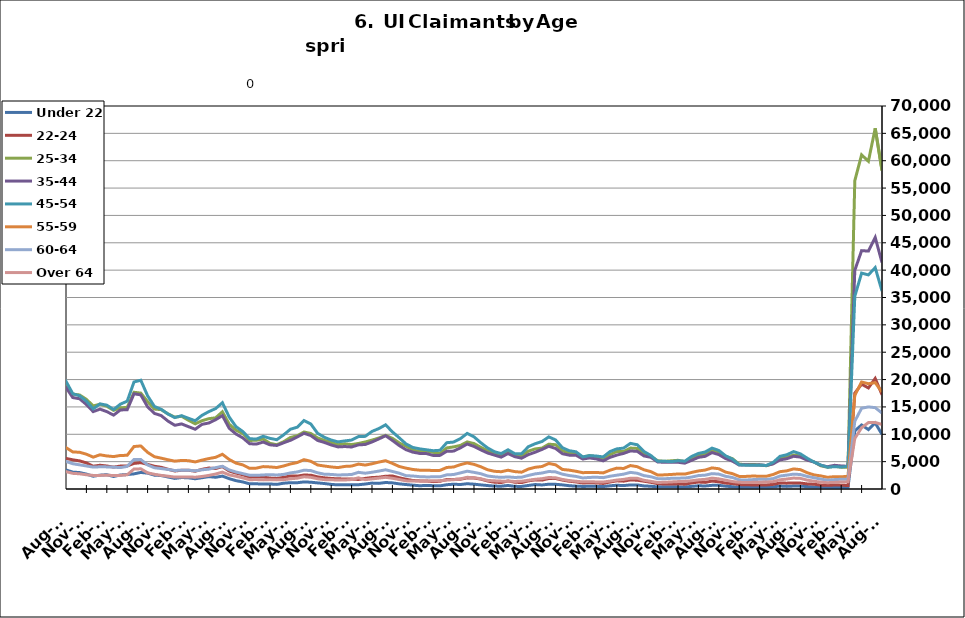
| Category | Under 22 | 22-24 | 25-34 | 35-44 | 45-54 | 55-59 | 60-64 | Over 64 |
|---|---|---|---|---|---|---|---|---|
| 1995-02-28 | 535 | 933 | 5740 | 6206 | 4029 | 1255 | 625 | 276 |
| 1995-03-31 | 534 | 992 | 5856 | 6433 | 4297 | 1294 | 686 | 323 |
| 1995-04-30 | 603 | 1125 | 6814 | 6965 | 4447 | 1392 | 730 | 338 |
| 1995-05-31 | 626 | 1171 | 7442 | 7404 | 4702 | 1383 | 751 | 333 |
| 1995-06-30 | 625 | 1218 | 7514 | 7778 | 4867 | 1435 | 813 | 366 |
| 1995-07-31 | 710 | 1296 | 8612 | 8864 | 5537 | 1595 | 891 | 407 |
| 1995-08-31 | 729 | 1248 | 8185 | 8719 | 5400 | 1604 | 982 | 406 |
| 1995-09-30 | 578 | 1028 | 6615 | 7150 | 4534 | 1351 | 862 | 338 |
| 1995-10-31 | 554 | 957 | 5805 | 6461 | 4159 | 1205 | 741 | 287 |
| 1995-11-30 | 468 | 845 | 5201 | 5826 | 3927 | 1155 | 702 | 254 |
| 1995-12-31 | 517 | 858 | 5350 | 5974 | 4010 | 1153 | 672 | 263 |
| 1996-01-31 | 543 | 927 | 5431 | 6086 | 4208 | 1221 | 685 | 301 |
| 1996-02-29 | 617 | 999 | 5667 | 6535 | 4480 | 1312 | 747 | 305 |
| 1996-03-31 | 622 | 981 | 5896 | 6557 | 4514 | 1362 | 763 | 306 |
| 1996-04-30 | 680 | 1140 | 7032 | 7649 | 5088 | 1527 | 856 | 345 |
| 1996-05-31 | 689 | 1163 | 7220 | 7819 | 5070 | 1521 | 832 | 366 |
| 1996-06-30 | 661 | 1145 | 7344 | 8173 | 5391 | 1568 | 844 | 388 |
| 1996-07-31 | 762 | 1250 | 8375 | 9181 | 6036 | 1755 | 973 | 432 |
| 1996-08-31 | 746 | 1145 | 7829 | 8585 | 5586 | 1651 | 950 | 435 |
| 1996-09-30 | 635 | 992 | 6399 | 7097 | 4790 | 1462 | 804 | 425 |
| 1996-10-31 | 572 | 851 | 5448 | 6291 | 4192 | 1259 | 693 | 340 |
| 1996-11-30 | 531 | 827 | 5003 | 5921 | 3908 | 1153 | 602 | 315 |
| 1996-12-31 | 521 | 789 | 4710 | 5510 | 3673 | 1110 | 610 | 284 |
| 1997-01-31 | 559 | 841 | 5203 | 6172 | 4321 | 1255 | 731 | 328 |
| 1997-02-28 | 556 | 841 | 5187 | 6162 | 4311 | 1250 | 727 | 326 |
| 1997-03-31 | 499 | 806 | 5125 | 6037 | 4176 | 1294 | 702 | 363 |
| 1997-04-30 | 545 | 885 | 5753 | 6709 | 4248 | 1339 | 734 | 339 |
| 1997-05-31 | 612 | 941 | 6146 | 7153 | 4458 | 1348 | 801 | 336 |
| 1997-06-30 | 623 | 995 | 6240 | 7298 | 4662 | 1302 | 776 | 348 |
| 1997-07-31 | 716 | 1154 | 7168 | 8554 | 5489 | 1509 | 903 | 415 |
| 1997-08-31 | 684 | 1072 | 6853 | 8093 | 5222 | 1487 | 837 | 416 |
| 1997-09-30 | 579 | 912 | 5522 | 6592 | 4348 | 1285 | 705 | 380 |
| 1997-10-31 | 516 | 817 | 4894.5 | 5892.5 | 3945 | 1159 | 625 | 344.5 |
| 1997-11-30 | 453 | 722 | 4267 | 5193 | 3542 | 1033 | 545 | 309 |
| 1997-12-31 | 413 | 682 | 3792 | 4755 | 3300 | 1023 | 490 | 266 |
| 1998-01-31 | 489 | 741 | 4044 | 5115 | 3513 | 1099 | 525 | 267 |
| 1998-02-28 | 435 | 684 | 3864 | 4903 | 3549 | 1043 | 571 | 285 |
| 1998-03-31 | 416 | 680 | 3855 | 5086 | 3703 | 1176 | 604 | 297 |
| 1998-04-30 | 592 | 813 | 5092 | 6219 | 4262 | 1336 | 688 | 332 |
| 1998-05-31 | 579 | 849 | 5319 | 6766 | 4554 | 1382 | 729 | 360 |
| 1998-06-30 | 568 | 899 | 5557 | 7101 | 4897 | 1405 | 783 | 367 |
| 1998-07-31 | 691 | 1031 | 6472 | 8095 | 5562 | 1589 | 880 | 392 |
| 1998-08-31 | 673 | 1007 | 6326 | 7950 | 5369 | 1574 | 935 | 393 |
| 1998-09-30 | 548 | 838 | 5206 | 6768 | 4703 | 1432 | 849 | 373 |
| 1998-10-31 | 496 | 776 | 4437 | 5582 | 3875 | 1250 | 711 | 302 |
| 1998-11-30 | 456 | 761 | 4182 | 5332 | 4015 | 1296 | 694 | 308 |
| 1998-12-31 | 442 | 722 | 4010 | 5198 | 4062 | 1331 | 656 | 290 |
| 1999-01-31 | 503 | 830 | 4502 | 5761 | 4521 | 1490 | 751 | 297 |
| 1999-02-28 | 463 | 756 | 4267 | 5576 | 4431 | 1470 | 767 | 301 |
| 1999-03-31 | 435 | 688 | 4119 | 5519 | 4403 | 1516 | 765 | 331 |
| 1999-04-30 | 591 | 949 | 5292 | 7089 | 5468 | 1724 | 914 | 489 |
| 1999-05-31 | 674 | 911 | 5611 | 7459 | 5457 | 1710 | 934 | 500 |
| 1999-06-30 | 640 | 906 | 5660 | 7503 | 5333 | 1695 | 920 | 495 |
| 1999-07-31 | 766 | 1132 | 6820 | 9256 | 6620 | 1981 | 1001 | 549 |
| 1999-08-31 | 738 | 1117 | 6737 | 9030 | 6670 | 2019 | 1075 | 582 |
| 1999-09-30 | 600 | 968 | 5167 | 7169 | 5458 | 1712 | 892 | 465 |
| 1999-10-31 | 494 | 813 | 4501 | 6048 | 4682 | 1443 | 743 | 363 |
| 1999-11-30 | 464 | 768 | 4228 | 5593 | 4564 | 1392 | 702 | 313 |
| 1999-12-31 | 468.5 | 754.5 | 4149 | 5486.5 | 4505 | 1429 | 673 | 304 |
| 2000-01-31 | 473 | 741 | 4070 | 5380 | 4446 | 1466 | 644 | 295 |
| 2000-02-29 | 460 | 691 | 3807 | 5357 | 4470 | 1469 | 707 | 310 |
| 2000-03-31 | 412 | 652 | 3864 | 5499 | 4568 | 1508 | 816 | 389 |
| 2000-04-30 | 585 | 829 | 4741 | 6891 | 5127 | 1631 | 906 | 451 |
| 2000-05-31 | 627 | 875 | 5086 | 7211 | 5238 | 1598 | 956 | 489 |
| 2000-06-30 | 675 | 983 | 5624 | 7826 | 5562 | 1669 | 941 | 524 |
| 2000-07-31 | 802 | 1109 | 6475 | 9102 | 6450 | 1927 | 1097 | 594 |
| 2000-08-31 | 787 | 1058 | 6045 | 8732 | 6157 | 1894 | 1085 | 616 |
| 2000-09-30 | 607 | 897 | 4766 | 6864 | 5037 | 1486 | 902 | 479 |
| 2000-10-31 | 544 | 760 | 4267 | 5897 | 4465 | 1323 | 762 | 394 |
| 2000-11-30 | 535 | 797 | 3982 | 5439 | 4318 | 1256 | 702 | 396 |
| 2000-12-31 | 508 | 832 | 3891 | 5255 | 4218 | 1246 | 694 | 361 |
| 2001-01-31 | 627 | 892 | 4229 | 5724 | 4777 | 1300 | 721 | 393 |
| 2001-02-28 | 643 | 934 | 4553 | 6302 | 5224 | 1529 | 849 | 472 |
| 2001-03-31 | 412 | 648 | 3625 | 5081 | 4551 | 1413 | 778 | 440 |
| 2001-04-30 | 875 | 1276 | 6577 | 8914 | 7196 | 2144 | 1185 | 639 |
| 2001-05-31 | 944 | 1399 | 7133 | 9570 | 7651 | 2265 | 1231 | 679 |
| 2001-06-30 | 1041 | 1584 | 8072 | 11034 | 8621 | 2613 | 1398 | 756 |
| 2001-07-31 | 1135 | 1806 | 9038 | 12514 | 9691 | 2970 | 1611 | 848 |
| 2001-08-31 | 1116 | 1776 | 8753 | 12045 | 9560 | 2963 | 1691 | 898 |
| 2001-09-30 | 1046 | 1705 | 8118 | 11025 | 8788 | 2784 | 1608 | 833 |
| 2001-10-31 | 1094 | 1785 | 8459 | 11114 | 8850 | 2772 | 1610 | 777 |
| 2001-11-30 | 1154 | 1931 | 9131 | 11576 | 9447 | 2973 | 1661 | 778 |
| 2001-12-31 | 1280 | 2191 | 9917 | 11961 | 9905 | 3152 | 1740 | 780 |
| 2002-01-31 | 1330 | 2255 | 10364 | 12730 | 10592 | 3378 | 1843 | 821 |
| 2002-02-28 | 1347 | 2339 | 10349 | 12730 | 10784 | 3499 | 1861 | 867 |
| 2002-03-31 | 1266 | 2231 | 9963 | 12747 | 10614 | 3499 | 1867 | 979 |
| 2002-04-30 | 1412 | 2488 | 11603 | 15825 | 13571 | 4631 | 2389 | 1146 |
| 2002-05-31 | 1455 | 2421 | 11243 | 15509 | 13148 | 4374 | 2359 | 1195 |
| 2002-06-30 | 1534 | 2479 | 11416 | 15594 | 13261 | 4343 | 2365 | 1180 |
| 2002-07-31 | 1513 | 2614 | 11895 | 16242 | 13727 | 4439 | 2428 | 1255 |
| 2002-08-31 | 1022 | 1977 | 8719 | 12054 | 10588 | 3454 | 1990 | 1047 |
| 2002-09-30 | 1391 | 2528 | 10478 | 14010 | 12008 | 3847 | 2161 | 1166 |
| 2002-10-31 | 1401 | 2385 | 9826 | 12727 | 10778 | 3498 | 1886 | 973 |
| 2002-11-30 | 1344 | 2390 | 9846 | 12059 | 10297 | 3367 | 1833 | 958 |
| 2002-12-31 | 1311 | 2403 | 9841 | 11670 | 10177 | 3369 | 1871 | 894 |
| 2003-01-31 | 1311 | 2403 | 9841 | 11670 | 10177 | 3369 | 1871 | 894 |
| 2003-02-28 | 1367 | 2275 | 9730 | 12433 | 10806 | 3687 | 2016 | 974 |
| 2003-03-31 | 1367 | 2357 | 9844 | 12620 | 11167 | 3825 | 2151 | 1094 |
| 2003-04-30 | 1549 | 2525 | 10619 | 14142 | 12182 | 4004 | 2304 | 1190 |
| 2003-05-31 | 1663 | 2698 | 10843 | 14795 | 12539 | 4102 | 2395 | 1256 |
| 2003-06-30 | 1755 | 2770 | 11350 | 15575 | 13251 | 4301 | 2493 | 1325 |
| 2003-07-31 | 1748 | 2791 | 11577 | 15863 | 13772 | 4465 | 2593 | 1371 |
| 2003-08-31 | 1718 | 2653 | 10998 | 15261 | 13219 | 4325 | 2522 | 1359 |
| 2003-09-30 | 1494 | 2521 | 10071 | 13565 | 11659 | 3828 | 2278 | 1286 |
| 2003-10-31 | 1329 | 2432 | 9388 | 12107 | 10693 | 3567 | 2036 | 1129 |
| 2003-11-30 | 1191 | 2226 | 8954 | 11297 | 10037 | 3414 | 2004 | 1068 |
| 2003-12-31 | 1206 | 2184 | 8530 | 10413 | 9335 | 3215 | 1854 | 994 |
| 2004-01-31 | 1216 | 2171 | 8382 | 9858 | 8955 | 2992 | 1736 | 963 |
| 2004-02-29 | 1118 | 1879 | 7614 | 8935 | 8176 | 2761 | 1617 | 943 |
| 2004-03-31 | 1099 | 1749 | 7152 | 8565 | 7769 | 2686 | 1608 | 981 |
| 2004-04-30 | 1241 | 1951 | 7653 | 9981 | 8741 | 2872 | 1685 | 1056 |
| 2004-05-31 | 1245 | 1934 | 7651 | 10203 | 8820 | 2928 | 1703 | 1079 |
| 2004-06-30 | 1316 | 2086 | 8172 | 10636 | 9362 | 3146 | 1843 | 1081 |
| 2004-07-31 | 1476 | 2265 | 8795 | 11511 | 10439 | 3497 | 2008 | 1171 |
| 2004-08-31 | 1390 | 2055 | 8008 | 10418 | 9514 | 3304 | 1909 | 1105 |
| 2004-09-30 | 1129 | 1820 | 6987 | 8661 | 7694 | 2755 | 1623 | 1046 |
| 2004-10-31 | 1037 | 1675 | 6590 | 7964 | 7029 | 2459 | 1461 | 882 |
| 2004-11-30 | 954 | 1638 | 6342 | 7570 | 6733 | 2294 | 1383 | 841 |
| 2004-12-31 | 857 | 1533 | 5921 | 6991 | 6333 | 2225 | 1287 | 764 |
| 2005-01-31 | 893 | 1539 | 6047 | 7410 | 6682 | 2253 | 1274 | 788 |
| 2005-02-28 | 846 | 1361 | 5650 | 6952 | 6404 | 2198 | 1326 | 786 |
| 2005-03-31 | 747 | 1258 | 5313 | 6595 | 6251 | 2151 | 1327 | 742 |
| 2005-04-30 | 877 | 1375 | 5696 | 7717 | 7230 | 2440 | 1401 | 844 |
| 2005-05-31 | 854 | 1408 | 5674 | 7905 | 7454 | 2482 | 1453 | 858 |
| 2005-06-30 | 819 | 1444 | 6028 | 8565 | 7899 | 2613 | 1547 | 890 |
| 2005-07-31 | 900 | 1461 | 6395 | 9124 | 8614 | 2864 | 1640 | 1004 |
| 2005-08-31 | 805 | 1439 | 5917 | 8271 | 8076 | 2692 | 1587 | 945 |
| 2005-09-30 | 631 | 1209 | 4978 | 6413 | 6203 | 2116 | 1312 | 724 |
| 2005-10-31 | 638 | 1134 | 4602 | 6028 | 5688 | 1997 | 1171 | 656 |
| 2005-11-30 | 564 | 1071 | 4409 | 5563 | 5105 | 1791 | 1035 | 580 |
| 2005-12-31 | 523 | 987 | 4014 | 4983 | 4531 | 1673 | 968 | 546 |
| 2006-01-31 | 531 | 925 | 3900 | 5012 | 4793 | 1691 | 1008 | 539 |
| 2006-02-28 | 447 | 804 | 3534 | 4388 | 4403 | 1586 | 980 | 549 |
| 2006-03-31 | 399 | 785 | 3455 | 4472 | 4584 | 1680 | 1069 | 618 |
| 2006-04-30 | 527 | 945 | 4004 | 5859 | 5921 | 1965 | 1251 | 744 |
| 2006-05-31 | 594 | 964 | 4205 | 6365 | 6369 | 2156 | 1327 | 792 |
| 2006-06-30 | 660 | 1113 | 4742 | 7052 | 7094 | 2386 | 1474 | 933 |
| 2006-07-31 | 771 | 1183 | 5214 | 7974 | 8007 | 2685 | 1635 | 1072 |
| 2006-08-31 | 737 | 1202 | 5116 | 7524 | 7553 | 2671 | 1590 | 1019 |
| 2006-09-30 | 596 | 1086 | 4608 | 6175 | 6389 | 2256 | 1287 | 812 |
| 2006-10-31 | 596 | 1056 | 4585 | 5758 | 5788 | 2026 | 1164 | 696 |
| 2006-11-30 | 542 | 1003 | 4370 | 5304 | 5388 | 1812 | 1082 | 604 |
| 2006-12-31 | 553 | 1102 | 4425 | 5291 | 5310 | 1801 | 1099 | 603 |
| 2007-01-31 | 587 | 1147 | 4542 | 5619 | 5506 | 1920 | 1174 | 663 |
| 2007-02-28 | 544 | 1090 | 4490 | 5562 | 5616 | 1982 | 1260 | 705 |
| 2007-03-31 | 558 | 1089 | 4498 | 5595 | 5708 | 2016 | 1378 | 717 |
| 2007-04-30 | 760 | 1203 | 5015 | 6827 | 6871 | 2316 | 1536 | 856 |
| 2007-05-31 | 806 | 1285 | 5542 | 7679 | 7763 | 2571 | 1719 | 1021 |
| 2007-06-30 | 862 | 1340 | 6100 | 8324 | 8341 | 2812 | 1896 | 1060 |
| 2007-07-31 | 980 | 1524 | 6616 | 9184 | 9522 | 3226 | 2038 | 1250 |
| 2007-08-31 | 950 | 1510 | 6266 | 8359 | 8842 | 3033 | 1949 | 1157 |
| 2007-09-30 | 865 | 1595 | 6213 | 7798 | 7957 | 2790 | 1816 | 1090 |
| 2007-10-31 | 883 | 1517 | 6214 | 7229 | 7503 | 2574 | 1630 | 978 |
| 2007-11-15 | 816 | 1424 | 5981 | 6740 | 6999 | 2468 | 1510 | 860 |
| 2007-12-15 09:36:00 | 851 | 1536 | 6411 | 6986 | 7174 | 2572 | 1584 | 874 |
| 2008-01-14 19:12:00 | 963 | 1628 | 6836 | 7533 | 7742 | 2786 | 1744 | 940 |
| 2008-02-14 04:48:00 | 982 | 1565 | 6847 | 7767 | 8031 | 2958 | 1823 | 985 |
| 2008-03-15 14:24:00 | 1029 | 1666 | 7210 | 8036 | 8353 | 3105 | 1898 | 1085 |
| 2008-04-15 | 1182 | 1889 | 7894 | 9339 | 9822 | 3537 | 2184 | 1246 |
| 2008-05-15 09:36:00 | 1325 | 2099 | 8651 | 10315 | 11003 | 3871 | 2423 | 1448 |
| 2008-06-14 19:12:00 | 1405 | 2238 | 9567 | 11330 | 12040 | 4322 | 2650 | 1572 |
| 2008-07-15 04:48:00 | 1616 | 2488 | 10336 | 12349 | 13396 | 4698 | 3083 | 1801 |
| 2008-08-14 14:24:00 | 1753 | 2665 | 10716 | 12486 | 13444 | 4795 | 3139 | 1802 |
| 2008-09-14 | 1800 | 2924 | 11552 | 12686 | 13602 | 4801 | 3180 | 1811 |
| 2008-10-14 09:36:00 | 1936 | 3131 | 12284 | 13322 | 13831 | 4989 | 3183 | 1808 |
| 2008-11-13 19:12:00 | 2093 | 3414 | 13577 | 14724 | 15130 | 5413 | 3440 | 1946 |
| 2008-12-14 04:48:00 | 2495 | 4020 | 15380 | 16325 | 16846 | 6098 | 3755 | 2155 |
| 2009-01-13 14:24:00 | 3054 | 4678 | 17678 | 18452 | 19095 | 6788 | 4182 | 2364 |
| 2009-02-13 | 3531 | 5304 | 19793 | 20788 | 21601 | 7727 | 4836 | 2718 |
| 2009-03-15 09:36:00 | 3891 | 5925 | 22303 | 23139 | 24352 | 8876 | 5515 | 3141 |
| 2009-04-14 19:12:00 | 4291 | 6403 | 23925 | 25362 | 26817 | 9618 | 6020 | 3494 |
| 2009-05-15 04:48:00 | 4410 | 6521 | 24301 | 25794 | 27238 | 9735 | 6181 | 3529 |
| 2009-06-14 14:24:00 | 4405 | 6853 | 25234 | 26806 | 28296 | 10256 | 6673 | 3804 |
| 2009-07-15 | 4729 | 7280 | 26132 | 27836 | 29724 | 10830 | 6950 | 4125 |
| 2009-08-14 09:36:00 | 4717 | 7069 | 25281 | 26184 | 27877 | 10164 | 6719 | 3918 |
| 2009-09-13 19:12:00 | 4741 | 7291 | 25029 | 24981 | 26018 | 9679 | 6210 | 3594 |
| 2009-10-14 04:48:00 | 4656 | 7051 | 24241 | 23779 | 24730 | 9034 | 5817 | 3422 |
| 2009-11-13 14:24:00 | 4421 | 6817 | 23760 | 22851 | 23515 | 8627 | 5549 | 3297 |
| 2009-12-14 | 4232 | 6586 | 23118 | 22038 | 22501 | 8496 | 5370 | 3295 |
| 2010-01-13 09:36:00 | 4276 | 6583 | 22706 | 21421 | 22132 | 8135 | 5154 | 3134 |
| 2010-02-12 19:12:00 | 4133 | 6142 | 21386 | 20012 | 21036 | 7728 | 5039 | 3047 |
| 2010-03-15 04:48:00 | 3784 | 5822 | 20418 | 19073 | 20556 | 7446 | 4983 | 3062 |
| 2010-04-14 14:24:00 | 3731 | 5751 | 20058 | 19261 | 21012 | 7449 | 5078 | 2936 |
| 2010-05-15 | 3516 | 5553 | 19393 | 18793 | 20409 | 7213 | 4923 | 2915 |
| 2010-06-14 09:36:00 | 3450 | 5640 | 19615 | 19385 | 20781 | 7547 | 5293 | 3043 |
| 2010-07-14 19:12:00 | 3536 | 5781 | 19820 | 19714 | 21269 | 7946 | 5439 | 3330 |
| 2010-08-14 04:48:00 | 3477 | 5590 | 18902 | 18548 | 19686 | 7561 | 5039 | 3181 |
| 2010-09-13 14:24:00 | 3083 | 5332 | 17344 | 16712 | 17408 | 6775 | 4612 | 2859 |
| 2010-10-14 | 3004 | 5138 | 17187 | 16492 | 17042 | 6713 | 4418 | 2779 |
| 2010-11-13 09:36:00 | 2724 | 4771 | 16387 | 15438 | 16061 | 6360 | 4209 | 2601 |
| 2010-12-13 19:12:00 | 2335 | 4159 | 15175 | 14143 | 14646 | 5823 | 4003 | 2480 |
| 2011-01-13 04:48:00 | 2530 | 4343 | 15492 | 14596 | 15561 | 6250 | 4059 | 2487 |
| 2011-02-12 14:24:00 | 2609 | 4202 | 15131 | 14142 | 15320 | 6044 | 4041 | 2517 |
| 2011-03-15 | 2290 | 3998 | 14370 | 13505 | 14523 | 5925 | 3990 | 2470 |
| 2011-04-14 09:36:00 | 2563 | 4190 | 14834 | 14445 | 15508 | 6130 | 3916 | 2488 |
| 2011-05-14 19:12:00 | 2642 | 4217 | 14917 | 14494 | 16051 | 6156 | 4129 | 2602 |
| 2011-06-14 04:48:00 | 2767 | 4676 | 17673 | 17404 | 19563 | 7763 | 5398 | 3653 |
| 2011-07-14 14:24:00 | 3027 | 4815 | 17530 | 17197 | 19880 | 7870 | 5384 | 3686 |
| 2011-08-14 | 2900 | 4498 | 15970 | 15020 | 17035 | 6697 | 4394 | 2956 |
| 2011-09-13 09:36:00 | 2531 | 4156 | 14609 | 13818 | 15092 | 5903 | 3881 | 2687 |
| 2011-10-13 19:12:00 | 2452 | 3959 | 14501 | 13415 | 14565 | 5635 | 3734 | 2491 |
| 2011-11-13 04:48:00 | 2197 | 3615 | 13732 | 12410 | 13698 | 5345 | 3574 | 2339 |
| 2011-12-13 14:24:00 | 1938 | 3290 | 13130 | 11646 | 13054 | 5089 | 3380 | 2177 |
| 2012-01-13 | 2098 | 3424 | 13293 | 11897 | 13400 | 5218 | 3448 | 2197 |
| 2012-02-12 09:36:00 | 2047 | 3428 | 12569 | 11400 | 12931 | 5177 | 3445 | 2212 |
| 2012-03-13 19:12:00 | 1870 | 3252 | 11913 | 10922 | 12476 | 4948 | 3317 | 2155 |
| 2012-04-13 04:48:00 | 2063 | 3590 | 12479 | 11814 | 13464 | 5278 | 3509 | 2287 |
| 2012-05-13 14:24:00 | 2260 | 3828 | 12852 | 12063 | 14139 | 5562 | 3628 | 2485 |
| 2012-06-13 | 2147 | 3747 | 13008 | 12659 | 14694 | 5791 | 3902 | 2736 |
| 2012-07-13 09:36:00 | 2358 | 4087 | 14109 | 13412 | 15770 | 6346 | 4156 | 3086 |
| 2012-08-12 19:12:00 | 1887 | 3284 | 11852 | 11102 | 13153 | 5396 | 3487 | 2583 |
| 2012-09-12 04:48:00 | 1524 | 2903 | 10742 | 10051 | 11393 | 4726 | 3103 | 2327 |
| 2012-10-12 14:24:00 | 1289 | 2603 | 10123 | 9339 | 10510 | 4405 | 2813 | 2032 |
| 2012-11-12 | 945 | 2155 | 8870 | 8273 | 9193 | 3781 | 2520 | 1702 |
| 2012-12-12 09:36:00 | 937 | 2201 | 8913 | 8210 | 9124 | 3816 | 2491 | 1722 |
| 2013-01-11 19:12:00 | 934 | 2199 | 9132 | 8579 | 9635 | 4095 | 2569 | 1667 |
| 2013-02-11 04:48:00 | 915 | 1996 | 8343 | 8072 | 9253 | 4034 | 2623 | 1715 |
| 2013-03-13 14:24:00 | 845 | 1934 | 8092 | 7955 | 9007 | 3929 | 2561 | 1667 |
| 2013-04-13 | 1055 | 2124 | 8637 | 8445 | 9891 | 4204 | 2666 | 1698 |
| 2013-05-13 09:36:00 | 1160 | 2394 | 9413 | 8898 | 10920 | 4574 | 2940 | 1871 |
| 2013-06-12 19:12:00 | 1145 | 2351 | 9732 | 9510 | 11293 | 4830 | 3115 | 1976 |
| 2013-07-13 04:48:00 | 1294 | 2558 | 10421 | 10174 | 12520 | 5363 | 3434 | 2233 |
| 2013-08-12 14:24:00 | 1238 | 2519 | 10150 | 9771 | 11886 | 5067 | 3372 | 2140 |
| 2013-09-12 | 1116 | 2214 | 9323 | 8874 | 10178 | 4389 | 2964 | 1871 |
| 2013-10-12 09:36:00 | 1000 | 2044 | 8893 | 8509 | 9449 | 4200 | 2701 | 1709 |
| 2013-11-11 19:12:00 | 842 | 1927 | 8532 | 8049 | 8950 | 4028 | 2665 | 1675 |
| 2013-12-12 04:48:00 | 753 | 1854 | 8098 | 7692 | 8612 | 3913 | 2557 | 1655 |
| 2014-01-11 14:24:00 | 788 | 1846 | 8270 | 7762 | 8786 | 4128 | 2606 | 1642 |
| 2014-02-11 | 795 | 1817 | 8124 | 7677 | 8944 | 4189 | 2646 | 1728 |
| 2014-03-13 09:36:00 | 782 | 1741 | 8319 | 8063 | 9583 | 4550 | 3048 | 2040 |
| 2014-04-12 19:12:00 | 905 | 1940 | 8594 | 8138 | 9620 | 4372 | 2886 | 1706 |
| 2014-05-13 04:48:00 | 1079 | 2093 | 8933 | 8593 | 10522 | 4609 | 3062 | 1850 |
| 2014-06-12 14:24:00 | 1028 | 2152 | 9323 | 9148 | 11040 | 4920 | 3274 | 1985 |
| 2014-07-13 | 1189 | 2333 | 9808 | 9735 | 11729 | 5171 | 3509 | 2133 |
| 2014-08-14 | 1119 | 2379 | 9259 | 8876 | 10438 | 4678 | 3210 | 1962 |
| 2014-09-13 09:36:00 | 943 | 2048 | 8430 | 7946 | 9358 | 4119 | 2891 | 1734 |
| 2014-10-13 19:12:00 | 816 | 1781 | 7821 | 7185 | 8244 | 3813 | 2437 | 1486 |
| 2014-11-13 04:48:00 | 703 | 1557 | 7150 | 6736 | 7594 | 3571 | 2374 | 1466 |
| 2014-12-13 14:24:00 | 597 | 1482 | 6833 | 6507 | 7340 | 3442 | 2255 | 1458 |
| 2015-01-13 | 646 | 1466 | 6927 | 6477 | 7168 | 3432 | 2210 | 1429 |
| 2015-02-12 09:36:00 | 607 | 1346 | 6696 | 6134 | 6999 | 3383 | 2220 | 1525 |
| 2015-03-14 19:12:00 | 577 | 1416 | 6499 | 6145 | 7077 | 3405 | 2233 | 1530 |
| 2015-04-14 04:48:00 | 784 | 1736 | 7505 | 6901 | 8468 | 3935 | 2586 | 1624 |
| 2015-05-14 14:24:00 | 875 | 1749 | 7696 | 6925 | 8578 | 4020 | 2644 | 1698 |
| 2015-06-14 | 818 | 1789 | 7961 | 7519 | 9200 | 4452 | 2943 | 1839 |
| 2015-07-14 09:36:00 | 966 | 2033 | 8609 | 8223 | 10167 | 4766 | 3254 | 2136 |
| 2015-08-13 19:12:00 | 880 | 2007 | 8302 | 7779 | 9530 | 4503 | 3045 | 2073 |
| 2015-09-13 04:48:00 | 752 | 1807 | 7615 | 7153 | 8455 | 4067 | 2798 | 1870 |
| 2015-10-13 14:24:00 | 630 | 1461 | 6995 | 6578 | 7509 | 3519 | 2375 | 1570 |
| 2015-11-13 | 533 | 1246 | 6491 | 6196 | 6815 | 3237 | 2224 | 1493 |
| 2015-12-13 09:36:00 | 512 | 1179 | 6242 | 5823 | 6474 | 3158 | 2123 | 1439 |
| 2016-01-12 19:12:00 | 646 | 1466 | 6927 | 6477 | 7168 | 3432 | 2210 | 1429 |
| 2016-02-12 04:48:00 | 482 | 1246 | 6101 | 5912 | 6452 | 3180 | 2110 | 1385 |
| 2016-03-13 14:24:00 | 474 | 1170 | 6011 | 5629 | 6452 | 3073 | 2152 | 1420 |
| 2016-04-13 | 648 | 1494 | 6917 | 6287 | 7737 | 3648 | 2483 | 1600 |
| 2016-05-13 09:36:00 | 812 | 1670 | 7326 | 6725 | 8279 | 3967 | 2765 | 1776 |
| 2016-06-12 19:12:00 | 738 | 1622 | 7479 | 7230 | 8681 | 4111 | 2920 | 1886 |
| 2016-07-13 04:48:00 | 875 | 1919 | 8193 | 7814 | 9525 | 4662 | 3196 | 2105 |
| 2016-08-12 14:24:00 | 858 | 1920 | 8091 | 7407 | 8969 | 4420 | 3130 | 2050 |
| 2016-09-12 | 752 | 1632 | 6992 | 6450 | 7548 | 3573 | 2713 | 1747 |
| 2016-10-12 09:36:00 | 602 | 1423 | 6590 | 6190 | 6998 | 3448 | 2457 | 1544 |
| 2016-11-11 19:12:00 | 523 | 1296 | 6418 | 6179 | 6801 | 3241 | 2299 | 1410 |
| 2016-12-12 04:48:00 | 468 | 1096 | 5827 | 5472 | 5867 | 2981 | 2019 | 1311 |
| 2017-01-11 14:24:00 | 495 | 1150 | 6111 | 5679 | 6108 | 3035 | 2115 | 1342 |
| 2017-02-11 | 484 | 1109 | 5882 | 5500 | 6023 | 3023 | 2148 | 1289 |
| 2017-03-13 09:36:00 | 442 | 1015 | 5634 | 5148 | 5865 | 2942 | 2075 | 1278 |
| 2017-04-12 19:12:00 | 585 | 1285 | 6292 | 5783 | 6842 | 3434 | 2336 | 1435 |
| 2017-05-13 04:48:00 | 686 | 1492 | 6844 | 6200 | 7332 | 3817 | 2526 | 1637 |
| 2017-06-12 14:24:00 | 623 | 1435 | 6852 | 6505 | 7473 | 3751 | 2713 | 1754 |
| 2017-07-13 | 745 | 1658 | 7483 | 6953 | 8339 | 4284 | 3038 | 1964 |
| 2017-08-12 09:36:00 | 745 | 1605 | 7411 | 6880 | 8092 | 4080 | 2878 | 1966 |
| 2017-09-11 19:12:00 | 559 | 1420 | 6481 | 6045 | 6845 | 3511 | 2443 | 1591 |
| 2017-10-12 04:48:00 | 503 | 1224 | 5960 | 5790 | 6135 | 3181 | 2245 | 1400 |
| 2017-11-11 14:24:00 | 390 | 972 | 5167 | 4951 | 5077 | 2553 | 1887 | 1188 |
| 2017-12-12 | 413 | 914 | 5058 | 4876 | 5071 | 2585 | 1870 | 1226 |
| 2018-01-11 09:36:00 | 411 | 912 | 5154 | 4909 | 5000 | 2656 | 1952 | 1288 |
| 2018-02-10 19:12:00 | 383 | 940 | 5246 | 4884 | 5165 | 2743 | 1980 | 1355 |
| 2018-03-13 04:48:00 | 373 | 875 | 5018 | 4724 | 5075 | 2723 | 1999 | 1389 |
| 2018-04-12 14:24:00 | 478 | 1104 | 5584 | 5240 | 5944 | 3026 | 2179 | 1506 |
| 2018-05-13 | 586 | 1275 | 6280 | 5780 | 6500 | 3300 | 2452 | 1670 |
| 2018-06-12 09:36:00 | 554 | 1207 | 6302 | 5974 | 6766 | 3462 | 2534 | 1762 |
| 2018-07-12 19:12:00 | 666 | 1445 | 7024 | 6656 | 7473 | 3858 | 2810 | 1989 |
| 2018-08-12 04:48:00 | 671 | 1323 | 6823 | 6293 | 7046 | 3706 | 2722 | 1850 |
| 2018-09-11 14:24:00 | 518 | 1084 | 5965 | 5563 | 6066 | 3091 | 2318 | 1618 |
| 2018-10-12 | 419 | 985 | 5538 | 5106 | 5464 | 2806 | 2102 | 1367 |
| 2018-11-11 09:36:00 | 306 | 808 | 4542 | 4371 | 4433 | 2297 | 1673 | 1222 |
| 2018-12-11 19:12:00 | 328 | 771 | 4439 | 4429 | 4340 | 2303 | 1646 | 1174 |
| 2019-01-11 04:48:00 | 327 | 743 | 4491 | 4378 | 4359 | 2368 | 1715 | 1218 |
| 2019-02-10 14:24:00 | 338 | 739 | 4402 | 4415 | 4345 | 2337 | 1773 | 1237 |
| 2019-03-13 | 306 | 738 | 4246 | 4293 | 4304 | 2328 | 1756 | 1281 |
| 2019-04-12 09:36:00 | 396 | 850 | 4657 | 4603 | 4871 | 2655 | 1900 | 1347 |
| 2019-05-12 19:12:00 | 541 | 1092 | 5700 | 5319 | 5974 | 3169 | 2371 | 1690 |
| 2019-06-12 04:48:00 | 476 | 1070 | 5822 | 5537 | 6262 | 3317 | 2534 | 1820 |
| 2019-07-12 14:24:00 | 538 | 1114 | 6206 | 5980 | 6836 | 3673 | 2717 | 1996 |
| 2019-08-12 | 528 | 1084 | 6044 | 5828 | 6422 | 3535 | 2645 | 1942 |
| 2019-09-11 09:36:00 | 445 | 932 | 5379 | 5275 | 5630 | 2979 | 2299 | 1624 |
| 2019-10-11 19:12:00 | 372 | 877 | 4949 | 4938 | 4922 | 2579 | 2058 | 1418 |
| 2019-11-11 04:48:00 | 332 | 701 | 4242 | 4332 | 4379 | 2392 | 1809 | 1247 |
| 2019-12-11 14:24:00 | 261 | 663 | 3977 | 4071 | 3974 | 2137 | 1619 | 1150 |
| 2020-01-11 | 272 | 724 | 4153 | 4331 | 4085 | 2258 | 1715 | 1206 |
| 2020-02-10 09:36:00 | 274 | 704 | 3992 | 4211 | 4020 | 2226 | 1784 | 1286 |
| 2020-03-11 19:12:00 | 291 | 630 | 3985 | 4153 | 4136 | 2332 | 1794 | 1308 |
| 2020-04-11 04:48:00 | 10628 | 17510 | 56346 | 39970 | 35225 | 17140 | 12379 | 9237 |
| 2020-05-11 14:24:00 | 11700 | 19159 | 61067 | 43562 | 39459 | 19553 | 14765 | 11197 |
| 2020-06-11 | 10859 | 18470 | 59897 | 43484 | 39131 | 19246 | 15000 | 12140 |
| 2020-07-11 09:36:00 | 12066 | 20204 | 65924 | 45983 | 40459 | 19436 | 14870 | 12160 |
| 2020-08-10 19:12:00 | 9989 | 17237 | 58218 | 41395 | 36191 | 17725 | 13875 | 11793 |